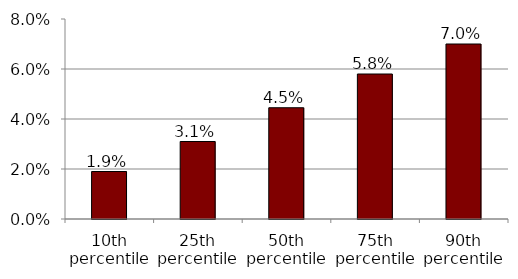
| Category | Series 0 |
|---|---|
| 10th percentile | 0.019 |
| 25th percentile | 0.031 |
| 50th percentile | 0.044 |
| 75th percentile | 0.058 |
| 90th percentile | 0.07 |